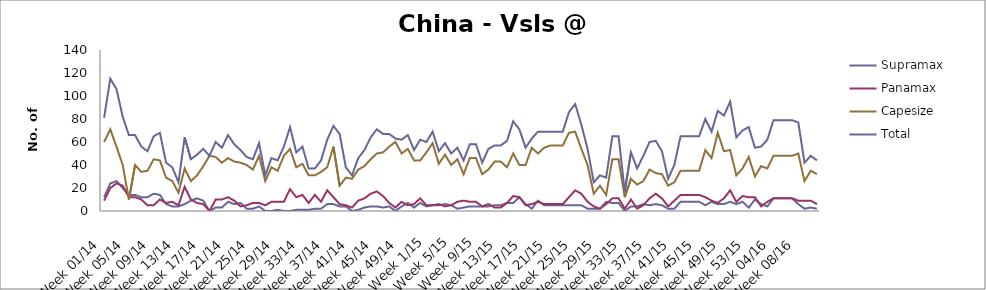
| Category | Supramax | Panamax | Capesize | Total |
|---|---|---|---|---|
| Week 01/14 | 12 | 9 | 60 | 81 |
| Week 02/14 | 24 | 20 | 71 | 115 |
| Week 03/14 | 26 | 24 | 56 | 106 |
| Week 04/14 | 20 | 22 | 40 | 82 |
| Week 05/14 | 14 | 12 | 10 | 66 |
| Week 06/14 | 14 | 12 | 40 | 66 |
| Week 07/14 | 12 | 10 | 34 | 56 |
| Week 08/14 | 12 | 5 | 35 | 52 |
| Week 09/14 | 15 | 5 | 45 | 65 |
| Week 10/14 | 14 | 10 | 44 | 68 |
| Week 11/14 | 6 | 7 | 29 | 42 |
| Week 12/14 | 4 | 8 | 26 | 38 |
| Week 13/14 | 4 | 5 | 16 | 25 |
| Week 14/14 | 6 | 21 | 37 | 64 |
| Week 15/14 | 9 | 10 | 26 | 45 |
| Week 16/14 | 11 | 7 | 31 | 49 |
| Week 17/14 | 9 | 6 | 39 | 54 |
| Week 18/14 | 0 | 0 | 48 | 48 |
| Week 19/14 | 3 | 10 | 47 | 60 |
| Week 20/14 | 3 | 10 | 42 | 55 |
| Week 21/14 | 8 | 12 | 46 | 66 |
| Week 22/14 | 6 | 9 | 43 | 58 |
| Week 23/14 | 7 | 4 | 42 | 53 |
| Week 24/14 | 2 | 5 | 40 | 47 |
| Week 25/14 | 2 | 7 | 36 | 45 |
| Week 26/14 | 4 | 7 | 48 | 59 |
| Week 27/14 | 0 | 5 | 26 | 31 |
| Week 28/14 | 0 | 8 | 38 | 46 |
| Week 29/14 | 1 | 8 | 35 | 44 |
| Week 30/14 | 0 | 8 | 48 | 56 |
| Week 31/14 | 0 | 19 | 54 | 73 |
| Week 32/14 | 1 | 12 | 38 | 51 |
| Week 33/14 | 1 | 14 | 41 | 56 |
| Week 34/14 | 1 | 7 | 31 | 37 |
| Week 35/14 | 2 | 14 | 31 | 37 |
| Week 36/14 | 2 | 8 | 34 | 44 |
| Week 37/14 | 6 | 18 | 38 | 62 |
| Week 38/14 | 6 | 12 | 56 | 74 |
| Week 39/14 | 4 | 6 | 22 | 67 |
| Week 40/14 | 4 | 5 | 29 | 38 |
| Week 41/14 | 0 | 3 | 28 | 31 |
| Week 42/14 | 1 | 9 | 36 | 46 |
| Week 43/14 | 3 | 11 | 39 | 53 |
| Week 44/14 | 4 | 15 | 45 | 64 |
| Week 45/14 | 4 | 17 | 50 | 71 |
| Week 46/14 | 3 | 13 | 51 | 67 |
| Week 47/14 | 4 | 7 | 56 | 67 |
| Week 48/14 | 0 | 3 | 60 | 63 |
| Week 49/14 | 4 | 8 | 50 | 62 |
| Week 50/14 | 7 | 5 | 54 | 66 |
| Week 51/14 | 3 | 6 | 44 | 53 |
| Week 52/14 | 7 | 11 | 44 | 62 |
| Week 1/15 | 4 | 5 | 51 | 60 |
| Week 2/15 | 5 | 5 | 59 | 69 |
| Week 3/15 | 5 | 6 | 41 | 52 |
| Week 4/15 | 6 | 4 | 49 | 59 |
| Week 5/15 | 5 | 5 | 40 | 50 |
| Week 6/15 | 2 | 8 | 45 | 55 |
| Week 7/15 | 3 | 9 | 32 | 44 |
| Week 8/15 | 4 | 8 | 46 | 58 |
| Week 9/15 | 4 | 8 | 46 | 58 |
| Week 10/15 | 4 | 4 | 32 | 42 |
| Week 11/15 | 4 | 6 | 36 | 54 |
| Week 12/15 | 5 | 3 | 43 | 57 |
| Week 13/15 | 5 | 3 | 43 | 57 |
| Week 14/15 | 7 | 7 | 38 | 61 |
| Week 15/15 | 7 | 13 | 50 | 78 |
| Week 16/15 | 12 | 12 | 40 | 71 |
| Week 17/15 | 6 | 5 | 40 | 55 |
| Week 18/15 | 2 | 6 | 55 | 63 |
| Week 19/15 | 9 | 8 | 50 | 69 |
| Week 20/15 | 5 | 6 | 55 | 69 |
| Week 21/15 | 5 | 6 | 57 | 69 |
| Week 22/15 | 5 | 6 | 57 | 69 |
| Week 23/15 | 5 | 6 | 57 | 69 |
| Week 24/15 | 5 | 12 | 68 | 86 |
| Week 25/15 | 5 | 18 | 69 | 93 |
| Week 26/15 | 5 | 15 | 54 | 75 |
| Week 27/15 | 2 | 8 | 40 | 54 |
| Week 28/15 | 2 | 4 | 15 | 25 |
| Week 29/15 | 2 | 2 | 22 | 31 |
| Week 30/15 | 8 | 6 | 14 | 29 |
| Week 31/15 | 7 | 11 | 45 | 65 |
| Week 32/15 | 7 | 11 | 45 | 65 |
| Week 33/15 | 0 | 2 | 12 | 17 |
| Week 34/15 | 4 | 10 | 28 | 51 |
| Week 35/15 | 4 | 2 | 23 | 37 |
| Week 36/15 | 6 | 5 | 26 | 48 |
| Week 37/15 | 5 | 11 | 36 | 60 |
| Week 38/15 | 6 | 15 | 33 | 61 |
| Week 39/15 | 5 | 11 | 32 | 52 |
| Week 40/15 | 2 | 4 | 22 | 28 |
| Week 41/15 | 2 | 9 | 25 | 40 |
| Week 42/15 | 8 | 14 | 35 | 65 |
| Week 43/15 | 8 | 14 | 35 | 65 |
| Week 44/15 | 8 | 14 | 35 | 65 |
| Week 45/15 | 8 | 14 | 35 | 65 |
| Week 46/15 | 5 | 12 | 53 | 80 |
| Week 47/15 | 8 | 9 | 46 | 69 |
| Week 48/15 | 6 | 7 | 68 | 87 |
| Week 49/15 | 6 | 11 | 52 | 83 |
| Week 50/15 | 8 | 18 | 53 | 95 |
| Week 51/15 | 6 | 8 | 31 | 64 |
| Week 52/15 | 8 | 13 | 37 | 70 |
| Week 53/15 | 3 | 12 | 47 | 73 |
| Week 01/16 | 10 | 12 | 30 | 55 |
| Week 02/16 | 6 | 4 | 39 | 56 |
| Week 03/16 | 4 | 8 | 37 | 62 |
| Week 04/16 | 11 | 11 | 48 | 79 |
| Week 05/16 | 11 | 11 | 48 | 79 |
| Week 06/16 | 11 | 11 | 48 | 79 |
| Week 07/16 | 11 | 11 | 48 | 79 |
| Week 08/16 | 6 | 9 | 50 | 77 |
| Week 09/16 | 2 | 9 | 26 | 42 |
| Week 10/16 | 3 | 9 | 35 | 48 |
| Week 11/16 | 2 | 6 | 32 | 44 |